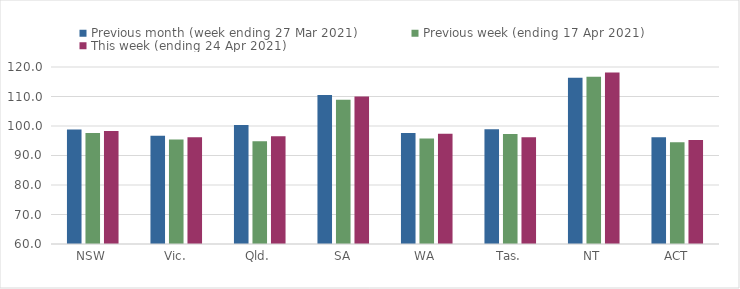
| Category | Previous month (week ending 27 Mar 2021) | Previous week (ending 17 Apr 2021) | This week (ending 24 Apr 2021) |
|---|---|---|---|
| NSW | 98.78 | 97.59 | 98.31 |
| Vic. | 96.69 | 95.44 | 96.2 |
| Qld. | 100.33 | 94.83 | 96.51 |
| SA | 110.5 | 108.93 | 109.96 |
| WA | 97.65 | 95.79 | 97.41 |
| Tas. | 98.91 | 97.25 | 96.16 |
| NT | 116.37 | 116.67 | 118.17 |
| ACT | 96.22 | 94.52 | 95.22 |